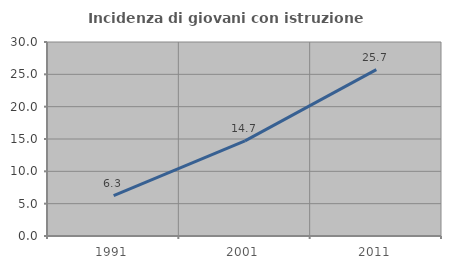
| Category | Incidenza di giovani con istruzione universitaria |
|---|---|
| 1991.0 | 6.25 |
| 2001.0 | 14.706 |
| 2011.0 | 25.735 |